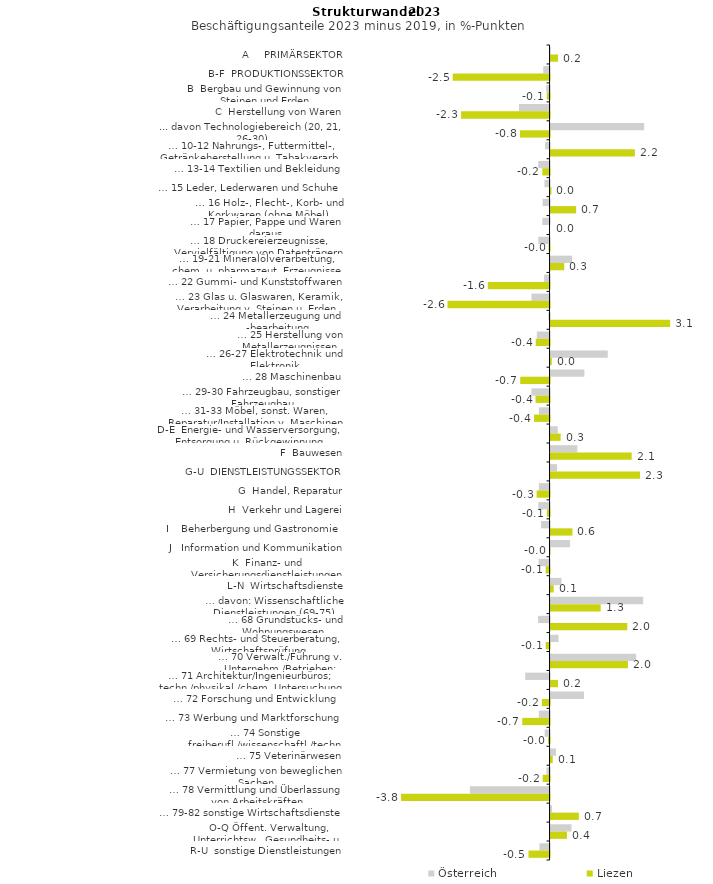
| Category | Österreich | Liezen |
|---|---|---|
| A     PRIMÄRSEKTOR | -0.007 | 0.19 |
| B-F  PRODUKTIONSSEKTOR | -0.161 | -2.476 |
| B  Bergbau und Gewinnung von Steinen und Erden | -0.086 | -0.071 |
| C  Herstellung von Waren | -0.782 | -2.261 |
| ... davon Technologiebereich (20, 21, 26-30) | 2.393 | -0.757 |
| … 10-12 Nahrungs-, Futtermittel-, Getränkeherstellung u. Tabakverarb. | -0.116 | 2.155 |
| … 13-14 Textilien und Bekleidung | -0.289 | -0.184 |
| … 15 Leder, Lederwaren und Schuhe | -0.13 | 0.022 |
| … 16 Holz-, Flecht-, Korb- und Korkwaren (ohne Möbel)  | -0.177 | 0.654 |
| … 17 Papier, Pappe und Waren daraus  | -0.185 | 0 |
| … 18 Druckereierzeugnisse, Vervielfältigung von Datenträgern | -0.288 | -0.026 |
| … 19-21 Mineralölverarbeitung, chem. u. pharmazeut. Erzeugnisse | 0.549 | 0.35 |
| … 22 Gummi- und Kunststoffwaren | -0.139 | -1.579 |
| … 23 Glas u. Glaswaren, Keramik, Verarbeitung v. Steinen u. Erden  | -0.462 | -2.608 |
| … 24 Metallerzeugung und -bearbeitung | -0.032 | 3.058 |
| … 25 Herstellung von Metallerzeugnissen  | -0.325 | -0.353 |
| … 26-27 Elektrotechnik und Elektronik | 1.462 | 0.031 |
| … 28 Maschinenbau | 0.864 | -0.75 |
| … 29-30 Fahrzeugbau, sonstiger Fahrzeugbau | -0.462 | -0.358 |
| … 31-33 Möbel, sonst. Waren, Reparatur/Installation v. Maschinen | -0.273 | -0.398 |
| D-E  Energie- und Wasserversorgung, Entsorgung u. Rückgewinnung | 0.184 | 0.258 |
| F  Bauwesen | 0.684 | 2.074 |
| G-U  DIENSTLEISTUNGSSEKTOR | 0.167 | 2.286 |
| G  Handel, Reparatur | -0.273 | -0.331 |
| H  Verkehr und Lagerei | -0.287 | -0.07 |
| I    Beherbergung und Gastronomie | -0.218 | 0.559 |
| J   Information und Kommunikation | 0.499 | -0.014 |
| K  Finanz- und Versicherungsdienstleistungen | -0.279 | -0.099 |
| L-N  Wirtschaftsdienste | 0.279 | 0.08 |
| … davon: Wissenschaftliche Dienstleistungen (69-75) | 2.367 | 1.283 |
| … 68 Grundstücks- und Wohnungswesen  | -0.294 | 1.962 |
| … 69 Rechts- und Steuerberatung, Wirtschaftsprüfung | 0.205 | -0.099 |
| … 70 Verwalt./Führung v. Unternehm./Betrieben; Unternehmensberat. | 2.188 | 1.978 |
| … 71 Architektur/Ingenieurbüros; techn./physikal./chem. Untersuchung | -0.622 | 0.191 |
| … 72 Forschung und Entwicklung  | 0.854 | -0.196 |
| … 73 Werbung und Marktforschung | -0.273 | -0.699 |
| … 74 Sonstige freiberufl./wissenschaftl./techn. Tätigkeiten | -0.124 | -0.04 |
| … 75 Veterinärwesen | 0.14 | 0.056 |
| … 77 Vermietung von beweglichen Sachen  | -0.077 | -0.176 |
| … 78 Vermittlung und Überlassung von Arbeitskräften | -2.035 | -3.796 |
| … 79-82 sonstige Wirtschaftsdienste | 0.039 | 0.723 |
| O-Q Öffent. Verwaltung, Unterrichtsw., Gesundheits- u. Sozialwesen | 0.535 | 0.419 |
| R-U  sonstige Dienstleistungen | -0.256 | -0.538 |